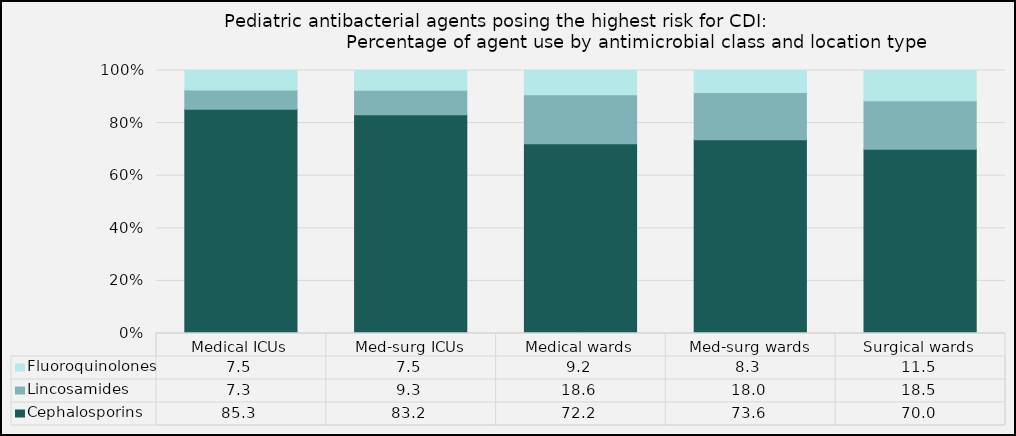
| Category | Cephalosporins | Lincosamides | Fluoroquinolones |
|---|---|---|---|
| Medical ICUs | 85.26 | 7.29 | 7.45 |
| Med-surg ICUs | 83.17 | 9.33 | 7.5 |
| Medical wards | 72.16 | 18.63 | 9.21 |
| Med-surg wards | 73.64 | 18.04 | 8.32 |
| Surgical wards | 70.03 | 18.5 | 11.47 |